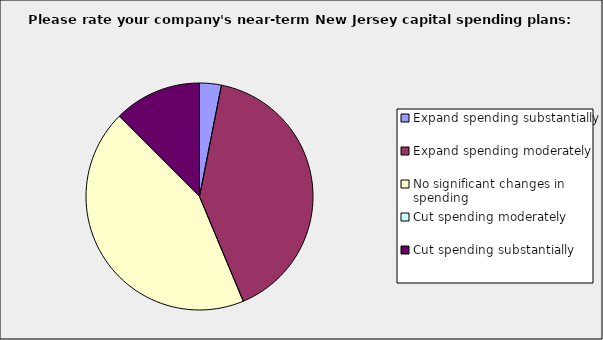
| Category | Series 0 |
|---|---|
| Expand spending substantially | 0.031 |
| Expand spending moderately | 0.406 |
| No significant changes in spending | 0.438 |
| Cut spending moderately | 0 |
| Cut spending substantially | 0.125 |